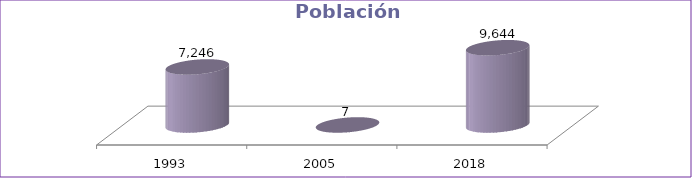
| Category | Población Total |
|---|---|
| 1993 | 7246 |
| 2005 | 7.1 |
| 2018 | 9644 |